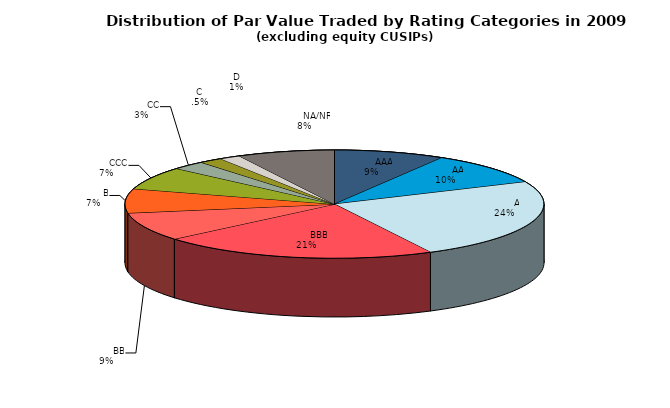
| Category | Series 0 |
|---|---|
|         AAA | 1868353.902 |
|         AA | 2109046.345 |
|         A | 5258389.168 |
|         BBB | 4660702.585 |
|         BB | 1853799.648 |
|         B | 1575704.932 |
|         CCC | 1485763.881 |
|         CC | 566629.108 |
|         C | 397345.426 |
|         D | 355969.466 |
|         NA/NR | 1635973.563 |